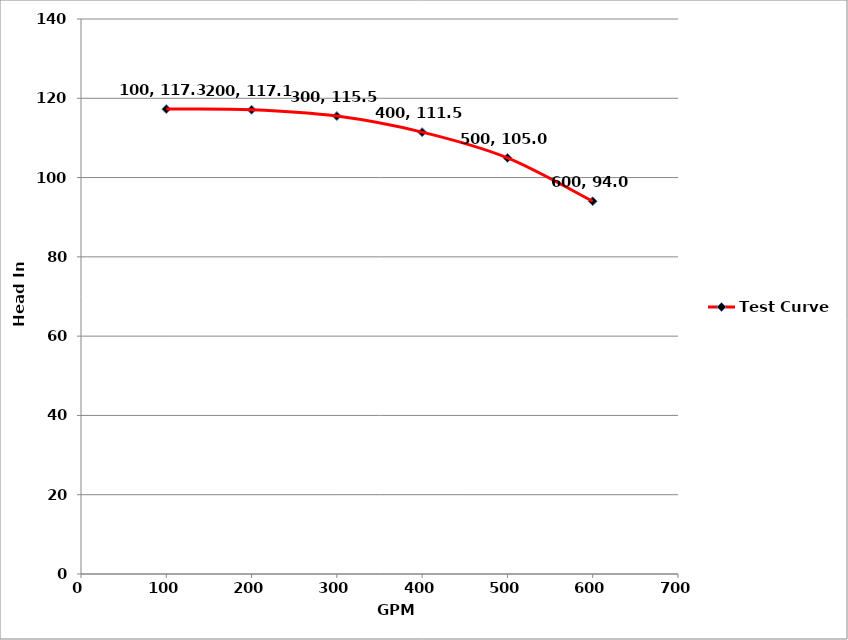
| Category | Test Curve |
|---|---|
| 100.0 | 117.278 |
| 200.0 | 117.114 |
| 300.0 | 115.506 |
| 400.0 | 111.455 |
| 500.0 | 104.961 |
| 600.0 | 94.024 |